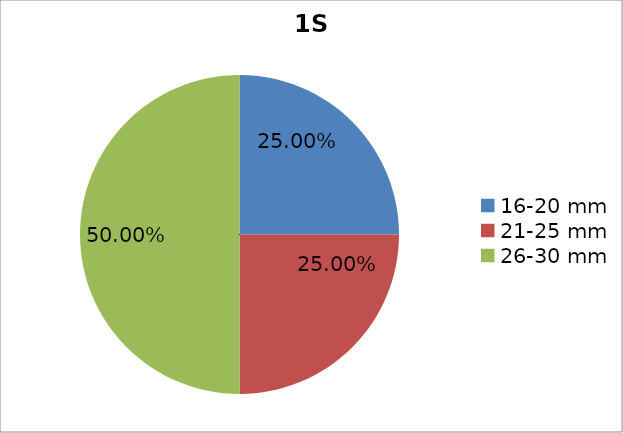
| Category | Series 0 |
|---|---|
| 16-20 mm | 0.25 |
| 21-25 mm | 0.25 |
| 26-30 mm | 0.5 |